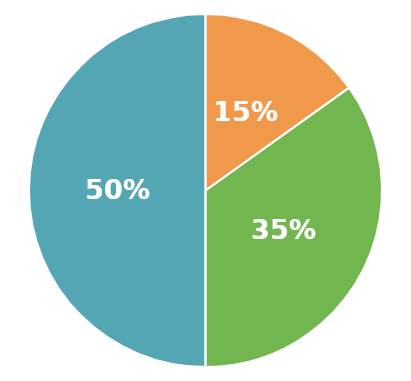
| Category | Series 0 |
|---|---|
| कुल संपत्तियाँ | 1902500 |
| कुल ऋण | 575000 |
| शुद्ध मूल्य | 1327500 |